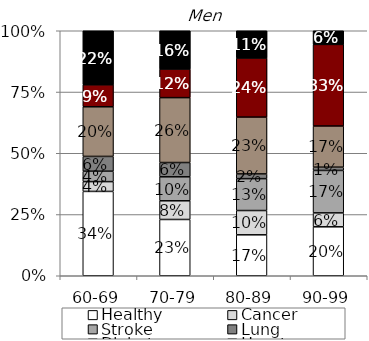
| Category | Healthy | Cancer | Stroke | Lung | Diabetes | Heart | Obesity |
|---|---|---|---|---|---|---|---|
| 60-69 | 0.344 | 0.04 | 0.042 | 0.06 | 0.203 | 0.09 | 0.221 |
| 70-79 | 0.23 | 0.076 | 0.098 | 0.058 | 0.265 | 0.117 | 0.156 |
| 80-89 | 0.167 | 0.099 | 0.13 | 0.019 | 0.232 | 0.241 | 0.111 |
| 90-99 | 0.2 | 0.057 | 0.173 | 0.013 | 0.168 | 0.333 | 0.056 |